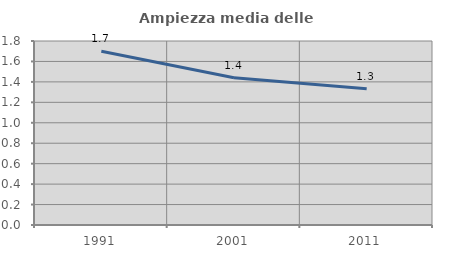
| Category | Ampiezza media delle famiglie |
|---|---|
| 1991.0 | 1.7 |
| 2001.0 | 1.441 |
| 2011.0 | 1.333 |